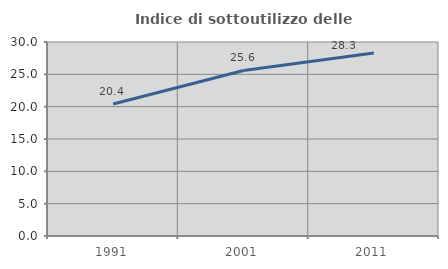
| Category | Indice di sottoutilizzo delle abitazioni  |
|---|---|
| 1991.0 | 20.404 |
| 2001.0 | 25.603 |
| 2011.0 | 28.311 |